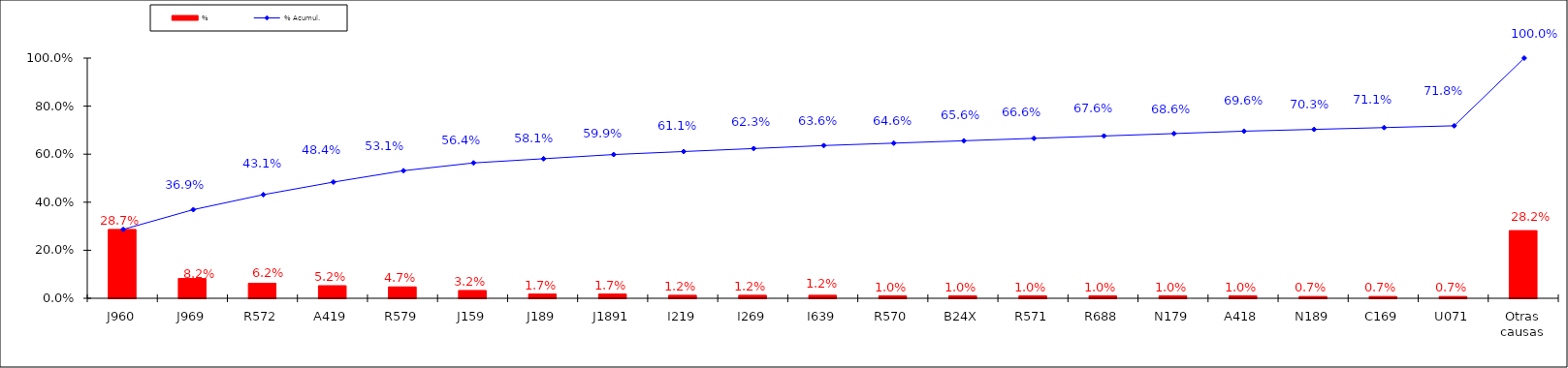
| Category | % |
|---|---|
| J960 | 0.287 |
| J969 | 0.082 |
| R572 | 0.062 |
| A419 | 0.052 |
| R579 | 0.047 |
| J159 | 0.032 |
| J189 | 0.017 |
| J1891 | 0.017 |
| I219 | 0.012 |
| I269 | 0.012 |
| I639 | 0.012 |
| R570 | 0.01 |
| B24X | 0.01 |
| R571 | 0.01 |
| R688 | 0.01 |
| N179 | 0.01 |
| A418 | 0.01 |
| N189 | 0.007 |
| C169 | 0.007 |
| U071 | 0.007 |
| Otras causas | 0.282 |